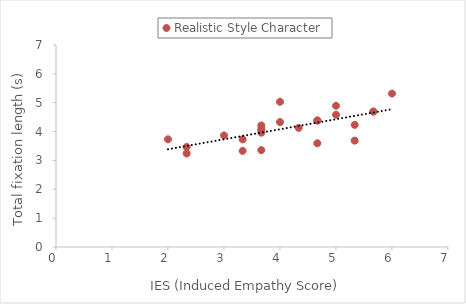
| Category | Realistic Style Character |
|---|---|
| 5.666666666666667 | 4.692 |
| 3.6666666666666665 | 3.962 |
| 2.3333333333333335 | 3.465 |
| 4.666666666666667 | 3.594 |
| 5.0 | 4.584 |
| 4.0 | 4.328 |
| 3.6666666666666665 | 4.038 |
| 5.0 | 4.894 |
| 2.0 | 3.731 |
| 5.333333333333333 | 3.686 |
| 3.6666666666666665 | 3.358 |
| 6.0 | 5.317 |
| 3.3333333333333335 | 3.729 |
| 5.666666666666667 | 4.693 |
| 3.6666666666666665 | 4.092 |
| 3.6666666666666665 | 4.211 |
| 5.333333333333333 | 4.232 |
| 3.0 | 3.866 |
| 4.666666666666667 | 4.383 |
| 2.3333333333333335 | 3.241 |
| 4.666666666666667 | 4.382 |
| 4.0 | 5.032 |
| 3.3333333333333335 | 3.331 |
| 4.333333333333333 | 4.128 |